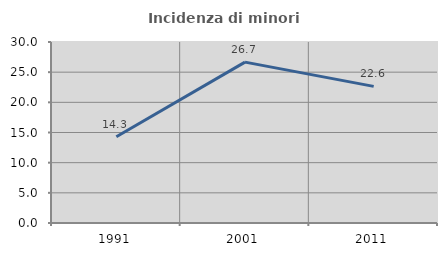
| Category | Incidenza di minori stranieri |
|---|---|
| 1991.0 | 14.286 |
| 2001.0 | 26.667 |
| 2011.0 | 22.642 |